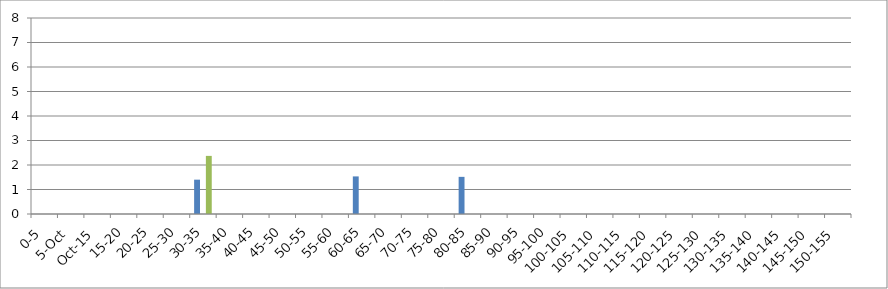
| Category | 119875 | 146067 | 241240 |
|---|---|---|---|
| 0-5 | 0 | 0 | 0 |
| 5-Oct | 0 | 0 | 0 |
| Oct-15 | 0 | 0 | 0 |
| 15-20 | 0 | 0 | 0 |
| 20-25 | 0 | 0 | 0 |
| 25-30 | 0 | 0 | 0 |
| 30-35 | 1.401 | 0 | 2.372 |
| 35-40 | 0 | 0 | 0 |
| 40-45 | 0 | 0 | 0 |
| 45-50 | 0 | 0 | 0 |
| 50-55 | 0 | 0 | 0 |
| 55-60 | 0 | 0 | 0 |
| 60-65 | 1.534 | 0 | 0 |
| 65-70 | 0 | 0 | 0 |
| 70-75 | 0 | 0 | 0 |
| 75-80 | 0 | 0 | 0 |
| 80-85 | 1.516 | 0 | 0 |
| 85-90 | 0 | 0 | 0 |
| 90-95 | 0 | 0 | 0 |
| 95-100 | 0 | 0 | 0 |
| 100-105 | 0 | 0 | 0 |
| 105-110 | 0 | 0 | 0 |
| 110-115 | 0 | 0 | 0 |
| 115-120 | 0 | 0 | 0 |
| 120-125 | 0 | 0 | 0 |
| 125-130 | 0 | 0 | 0 |
| 130-135 | 0 | 0 | 0 |
| 135-140 | 0 | 0 | 0 |
| 140-145 | 0 | 0 | 0 |
| 145-150 | 0 | 0 | 0 |
| 150-155 | 0 | 0 | 0 |